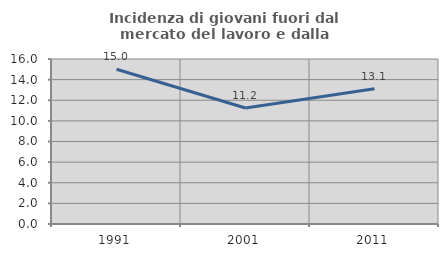
| Category | Incidenza di giovani fuori dal mercato del lavoro e dalla formazione  |
|---|---|
| 1991.0 | 15.005 |
| 2001.0 | 11.246 |
| 2011.0 | 13.105 |